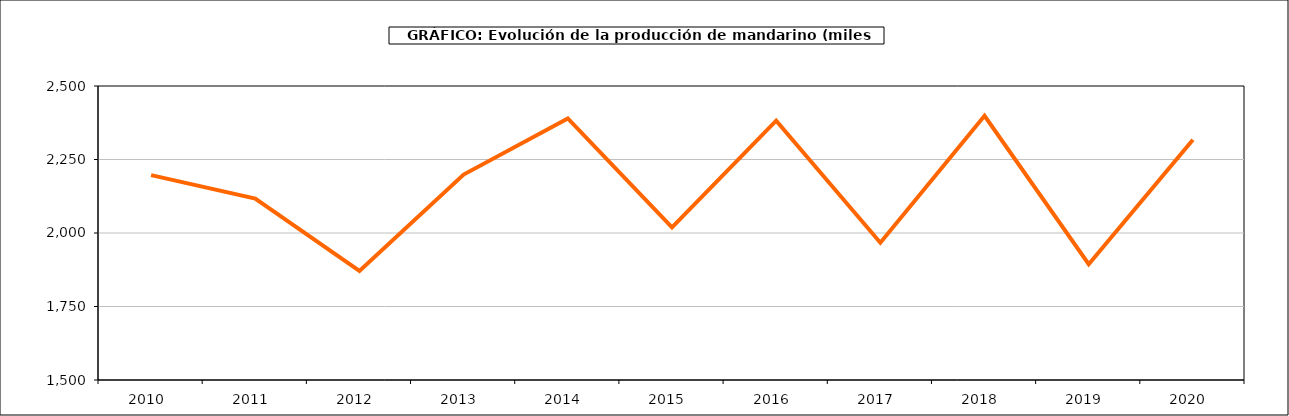
| Category | producción |
|---|---|
| 2010.0 | 2196.89 |
| 2011.0 | 2117.119 |
| 2012.0 | 1871.265 |
| 2013.0 | 2198.926 |
| 2014.0 | 2389.894 |
| 2015.0 | 2018.755 |
| 2016.0 | 2382.073 |
| 2017.0 | 1967.018 |
| 2018.0 | 2398.621 |
| 2019.0 | 1893.951 |
| 2020.0 | 2317.019 |